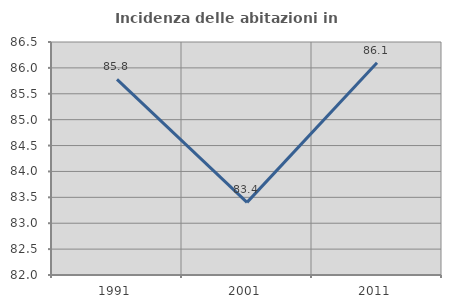
| Category | Incidenza delle abitazioni in proprietà  |
|---|---|
| 1991.0 | 85.778 |
| 2001.0 | 83.402 |
| 2011.0 | 86.099 |